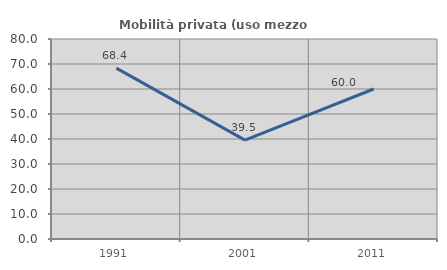
| Category | Mobilità privata (uso mezzo privato) |
|---|---|
| 1991.0 | 68.354 |
| 2001.0 | 39.535 |
| 2011.0 | 60 |